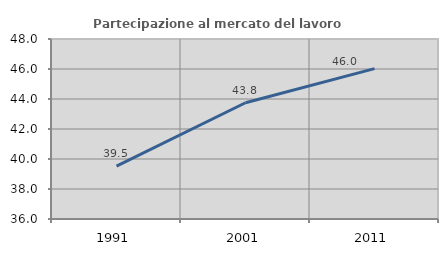
| Category | Partecipazione al mercato del lavoro  femminile |
|---|---|
| 1991.0 | 39.526 |
| 2001.0 | 43.75 |
| 2011.0 | 46.023 |